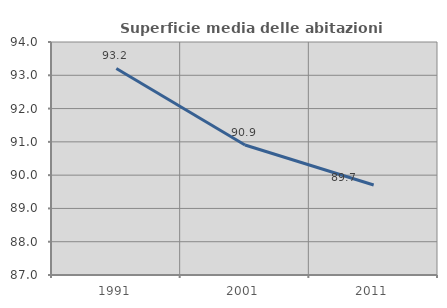
| Category | Superficie media delle abitazioni occupate |
|---|---|
| 1991.0 | 93.206 |
| 2001.0 | 90.907 |
| 2011.0 | 89.703 |